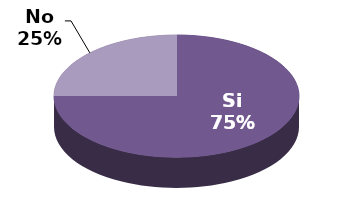
| Category | Series 1 |
|---|---|
| Si | 6 |
| No | 2 |